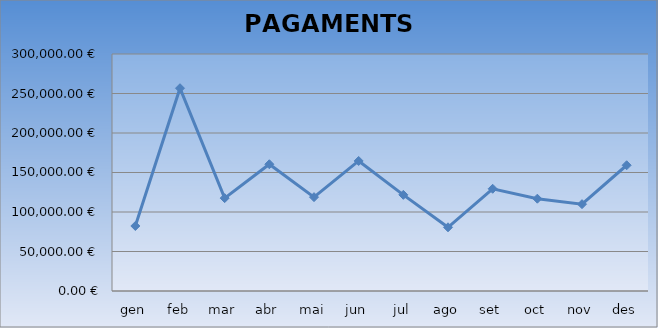
| Category | Series 0 |
|---|---|
| gen | 82281.32 |
| feb | 256678.82 |
| mar | 117554.06 |
| abr | 160446.92 |
| mai | 118792.81 |
| jun | 164624.09 |
| jul | 121698.35 |
| ago | 80641.44 |
| set | 129397.93 |
| oct | 116835.87 |
| nov | 109921.02 |
| des | 159175.45 |